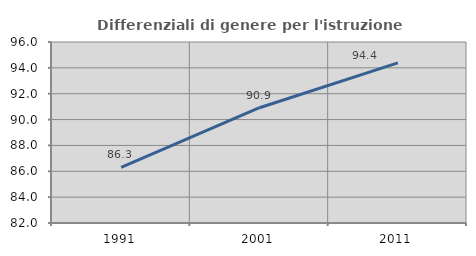
| Category | Differenziali di genere per l'istruzione superiore |
|---|---|
| 1991.0 | 86.295 |
| 2001.0 | 90.915 |
| 2011.0 | 94.381 |